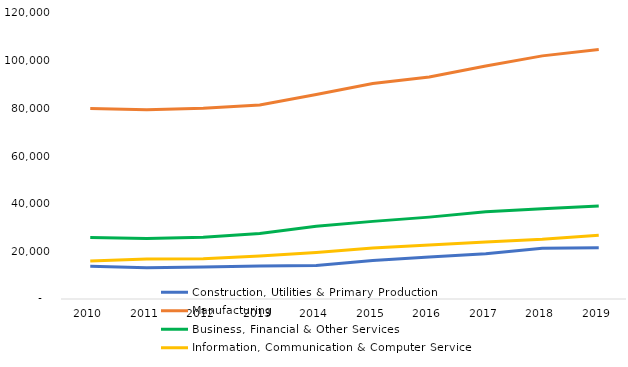
| Category | Construction, Utilities & Primary Production  | Manufacturing  | Business, Financial & Other Services | Information, Communication & Computer Services |
|---|---|---|---|---|
| 2010.0 | 13700 | 79894 | 25849 | 15953 |
| 2011.0 | 13153 | 79424 | 25399 | 16746 |
| 2012.0 | 13414 | 80041 | 25926 | 16916 |
| 2013.0 | 13882 | 81393 | 27532 | 18037 |
| 2014.0 | 14097 | 85769 | 30538 | 19509 |
| 2015.0 | 16194 | 90454 | 32571 | 21379 |
| 2016.0 | 17602 | 93128 | 34353 | 22693 |
| 2017.0 | 18996 | 97783 | 36560 | 23967 |
| 2018.0 | 21338 | 102008 | 37816 | 25046 |
| 2019.0 | 21500 | 104678 | 39029 | 26699 |